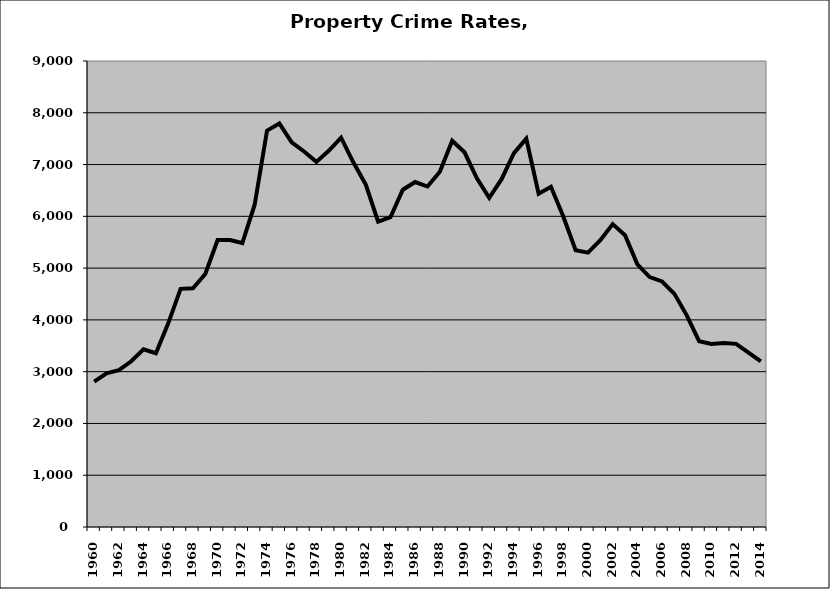
| Category | Property |
|---|---|
| 1960.0 | 2806.028 |
| 1961.0 | 2969.375 |
| 1962.0 | 3028.098 |
| 1963.0 | 3200.385 |
| 1964.0 | 3432.258 |
| 1965.0 | 3355.535 |
| 1966.0 | 3933.56 |
| 1967.0 | 4599.755 |
| 1968.0 | 4610.838 |
| 1969.0 | 4885.411 |
| 1970.0 | 5543.921 |
| 1971.0 | 5540.887 |
| 1972.0 | 5484.37 |
| 1973.0 | 6223.955 |
| 1974.0 | 7654.947 |
| 1975.0 | 7793.66 |
| 1976.0 | 7431.101 |
| 1977.0 | 7252.962 |
| 1978.0 | 7051.742 |
| 1979.0 | 7264.367 |
| 1980.0 | 7519.932 |
| 1981.0 | 7038.131 |
| 1982.0 | 6614.021 |
| 1983.0 | 5897.401 |
| 1984.0 | 5983.295 |
| 1985.0 | 6513.681 |
| 1986.0 | 6663.099 |
| 1987.0 | 6575.989 |
| 1988.0 | 6861.166 |
| 1989.0 | 7460.18 |
| 1990.0 | 7236.357 |
| 1991.0 | 6734.907 |
| 1992.0 | 6357.751 |
| 1993.0 | 6716.743 |
| 1994.0 | 7221.423 |
| 1995.0 | 7500.119 |
| 1996.0 | 6435.501 |
| 1997.0 | 6571.306 |
| 1998.0 | 5997.023 |
| 1999.0 | 5344.982 |
| 2000.0 | 5297.807 |
| 2001.0 | 5537.514 |
| 2002.0 | 5849.82 |
| 2003.0 | 5634.029 |
| 2004.0 | 5073.33 |
| 2005.0 | 4826.888 |
| 2006.0 | 4741.598 |
| 2007.0 | 4502.556 |
| 2008.0 | 4087.807 |
| 2009.0 | 3588.978 |
| 2010.0 | 3533.986 |
| 2011.0 | 3554.736 |
| 2012.0 | 3536.799 |
| 2013.0 | 3365.397 |
| 2014.0 | 3197.512 |